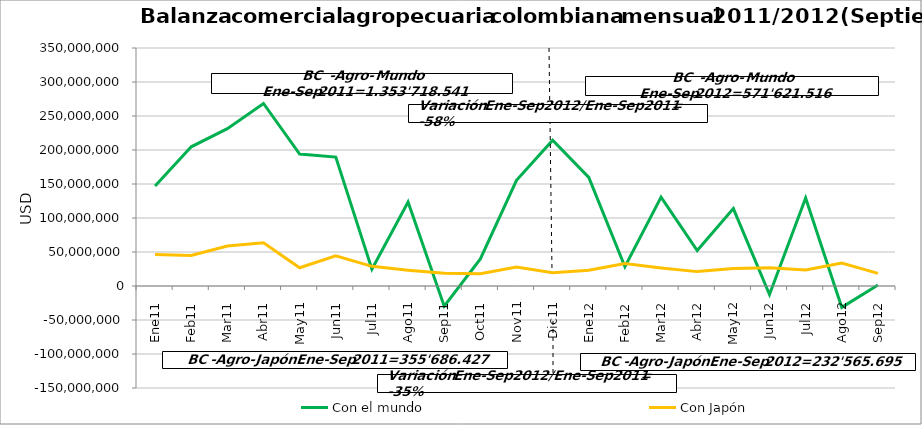
| Category | Con el mundo | Con Japón |
|---|---|---|
| 0 | 147170268.9 | 46256693.08 |
| 1 | 204650116.66 | 44920447.43 |
| 2 | 231423347.81 | 58768722.04 |
| 3 | 268381287.56 | 63518132.95 |
| 4 | 193958950.79 | 26860370.56 |
| 5 | 189518018.45 | 44433389.61 |
| 6 | 24694762.16 | 28927598 |
| 7 | 123602889.05 | 23264044.07 |
| 8 | -29681100.27 | 18737028.87 |
| 9 | 39906361.62 | 18165677.87 |
| 10 | 155339935.17 | 27953644.69 |
| 11 | 214358903.69 | 19653618.9 |
| 12 | 159718811.51 | 23282914.95 |
| 13 | 28364992.2 | 33046362.64 |
| 14 | 130703935.59 | 26543198.29 |
| 15 | 52247887.52 | 21149677.45 |
| 16 | 113869665.14 | 25860571.84 |
| 17 | -12554667.46 | 26788837.59 |
| 18 | 129307489.88 | 23559228.52 |
| 19 | -31469488.76 | 33715206.71 |
| 20 | 1432890.8 | 18619696.64 |